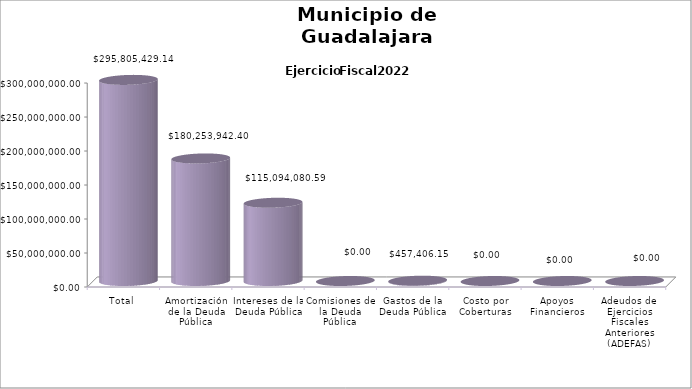
| Category | Municipio de Guadalajara
Deuda Pública 2022 |
|---|---|
| Total | 295805429.14 |
| Amortización de la Deuda Pública | 180253942.4 |
| Intereses de la Deuda Pública | 115094080.59 |
| Comisiones de la Deuda Pública | 0 |
| Gastos de la Deuda Pública | 457406.15 |
| Costo por Coberturas | 0 |
| Apoyos Financieros | 0 |
| Adeudos de Ejercicios Fiscales Anteriores (ADEFAS) | 0 |